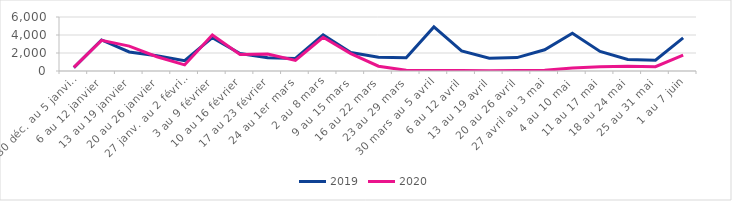
| Category | 2019 | 2020 |
|---|---|---|
| 30 déc. au 5 janvier | 369 | 411 |
| 6 au 12 janvier | 3446 | 3403 |
| 13 au 19 janvier | 2117 | 2765 |
| 20 au 26 janvier | 1689 | 1588 |
| 27 janv. au 2 février | 1140 | 678 |
| 3 au 9 février | 3711 | 4006 |
| 10 au 16 février | 1947 | 1835 |
| 17 au 23 février | 1464 | 1876 |
| 24 au 1er mars | 1389 | 1183 |
| 2 au 8 mars | 4019 | 3745 |
| 9 au 15 mars | 2049 | 1936 |
| 16 au 22 mars | 1525 | 536 |
| 23 au 29 mars | 1473 | 75 |
| 30 mars au 5 avril | 4896 | 61 |
| 6 au 12 avril | 2237 | 69 |
| 13 au 19 avril | 1410 | 40 |
| 20 au 26 avril | 1489 | 60 |
| 27 avril au 3 mai | 2361 | 79 |
| 4 au 10 mai | 4200 | 326 |
| 11 au 17 mai | 2172 | 463 |
| 18 au 24 mai | 1275 | 523 |
| 25 au 31 mai | 1190 | 482 |
| 1 au 7 juin | 3685 | 1772 |